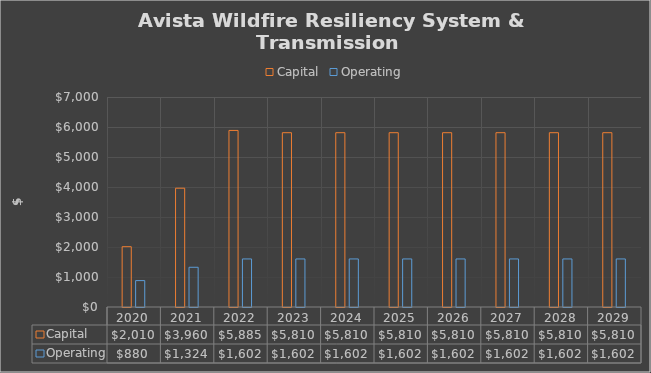
| Category | Capital | Operating |
|---|---|---|
| 2020.0 | 2010 | 880 |
| 2021.0 | 3960 | 1324.167 |
| 2022.0 | 5885 | 1601.667 |
| 2023.0 | 5810 | 1601.667 |
| 2024.0 | 5810 | 1601.667 |
| 2025.0 | 5810 | 1601.667 |
| 2026.0 | 5810 | 1601.667 |
| 2027.0 | 5810 | 1601.667 |
| 2028.0 | 5810 | 1601.667 |
| 2029.0 | 5810 | 1601.667 |